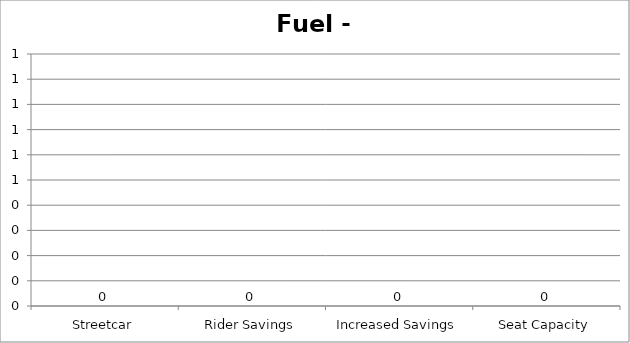
| Category | Fuel - GGE |
|---|---|
| Streetcar | 0 |
| Rider Savings | 0 |
| Increased Savings | 0 |
| Seat Capacity | 0 |